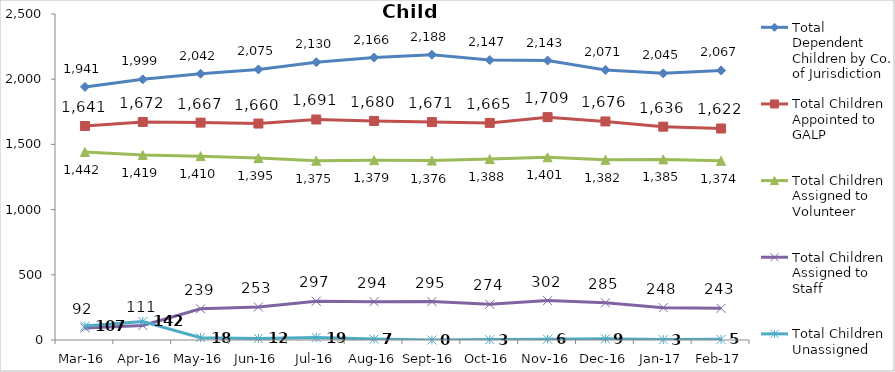
| Category | Total Dependent Children by Co. of Jurisdiction | Total Children Appointed to GALP | Total Children Assigned to Volunteer | Total Children Assigned to Staff | Total Children Unassigned |
|---|---|---|---|---|---|
| Mar-16 | 1941 | 1641 | 1442 | 92 | 107 |
| Apr-16 | 1999 | 1672 | 1419 | 111 | 142 |
| May-16 | 2042 | 1667 | 1410 | 239 | 18 |
| Jun-16 | 2075 | 1660 | 1395 | 253 | 12 |
| Jul-16 | 2130 | 1691 | 1375 | 297 | 19 |
| Aug-16 | 2166 | 1680 | 1379 | 294 | 7 |
| Sep-16 | 2188 | 1671 | 1376 | 295 | 0 |
| Oct-16 | 2147 | 1665 | 1388 | 274 | 3 |
| Nov-16 | 2143 | 1709 | 1401 | 302 | 6 |
| Dec-16 | 2071 | 1676 | 1382 | 285 | 9 |
| Jan-17 | 2045 | 1636 | 1385 | 248 | 3 |
| Feb-17 | 2067 | 1622 | 1374 | 243 | 5 |